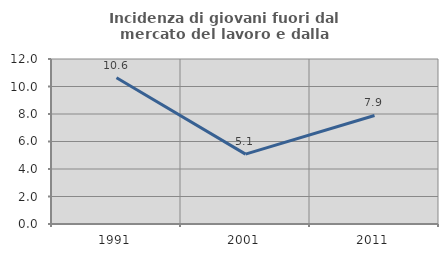
| Category | Incidenza di giovani fuori dal mercato del lavoro e dalla formazione  |
|---|---|
| 1991.0 | 10.638 |
| 2001.0 | 5.085 |
| 2011.0 | 7.895 |